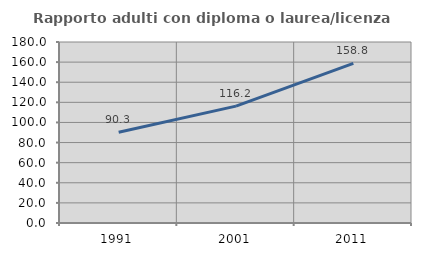
| Category | Rapporto adulti con diploma o laurea/licenza media  |
|---|---|
| 1991.0 | 90.28 |
| 2001.0 | 116.239 |
| 2011.0 | 158.798 |